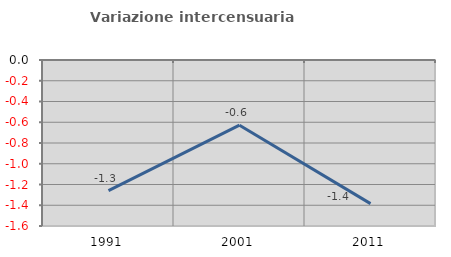
| Category | Variazione intercensuaria annua |
|---|---|
| 1991.0 | -1.259 |
| 2001.0 | -0.628 |
| 2011.0 | -1.385 |